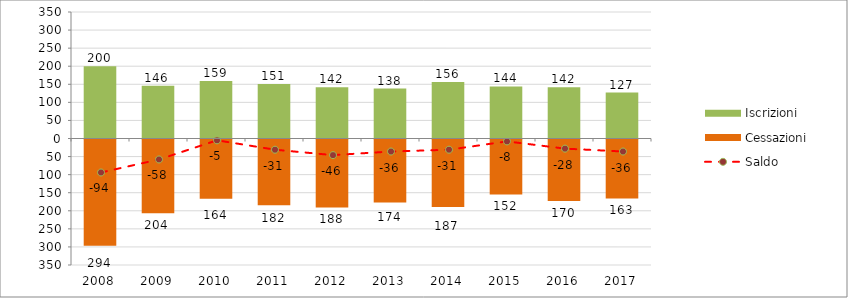
| Category | Iscrizioni | Cessazioni |
|---|---|---|
| 2008.0 | 200 | -294 |
| 2009.0 | 146 | -204 |
| 2010.0 | 159 | -164 |
| 2011.0 | 151 | -182 |
| 2012.0 | 142 | -188 |
| 2013.0 | 138 | -174 |
| 2014.0 | 156 | -187 |
| 2015.0 | 144 | -152 |
| 2016.0 | 142 | -170 |
| 2017.0 | 127 | -163 |